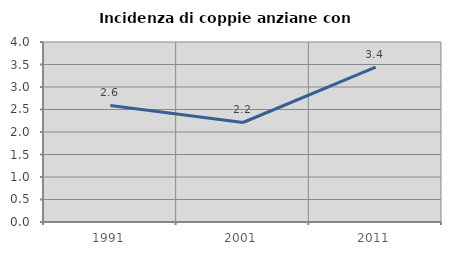
| Category | Incidenza di coppie anziane con figli |
|---|---|
| 1991.0 | 2.59 |
| 2001.0 | 2.211 |
| 2011.0 | 3.441 |